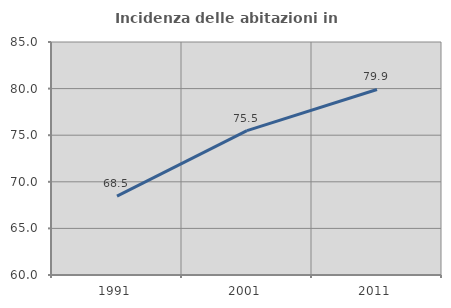
| Category | Incidenza delle abitazioni in proprietà  |
|---|---|
| 1991.0 | 68.454 |
| 2001.0 | 75.49 |
| 2011.0 | 79.904 |